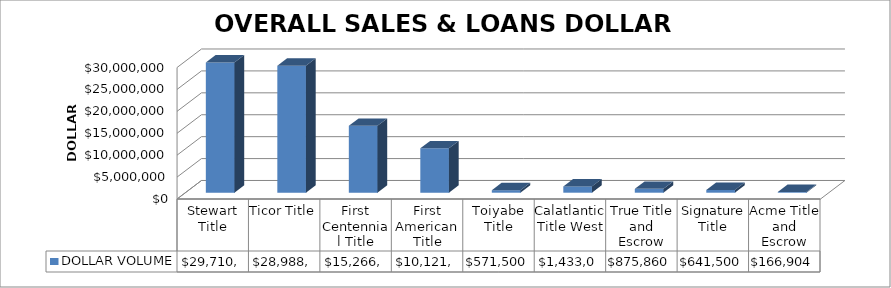
| Category | DOLLAR VOLUME |
|---|---|
| Stewart Title | 29710881 |
| Ticor Title | 28988566 |
| First Centennial Title | 15266441 |
| First American Title | 10121437 |
| Toiyabe Title | 571500 |
| Calatlantic Title West | 1433099 |
| True Title and Escrow | 875860 |
| Signature Title | 641500 |
| Acme Title and Escrow | 166904 |